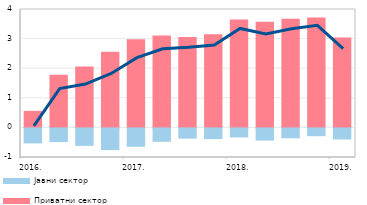
| Category | Приватни сектор | Јавни сектор |
|---|---|---|
| 2016. | 0.559 | -0.507 |
| II | 1.776 | -0.463 |
| III | 2.053 | -0.589 |
| IV | 2.556 | -0.733 |
| 2017. | 2.977 | -0.621 |
| II | 3.109 | -0.452 |
| III | 3.055 | -0.347 |
| IV | 3.145 | -0.363 |
| 2018. | 3.649 | -0.305 |
| II | 3.567 | -0.411 |
| III | 3.668 | -0.334 |
| IV | 3.71 | -0.263 |
| 2019. | 3.039 | -0.375 |